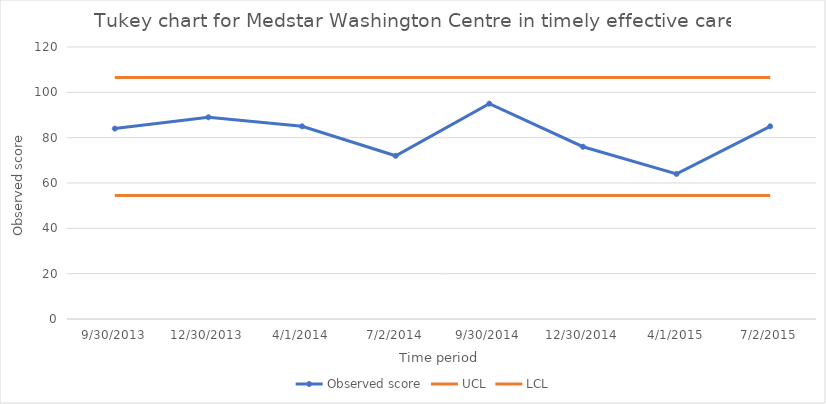
| Category | Observed score | UCL | LCL |
|---|---|---|---|
| 9/30/13 | 84 | 106.5 | 54.5 |
| 12/30/13 | 89 | 106.5 | 54.5 |
| 4/1/14 | 85 | 106.5 | 54.5 |
| 7/2/14 | 72 | 106.5 | 54.5 |
| 9/30/14 | 95 | 106.5 | 54.5 |
| 12/30/14 | 76 | 106.5 | 54.5 |
| 4/1/15 | 64 | 106.5 | 54.5 |
| 7/2/15 | 85 | 106.5 | 54.5 |